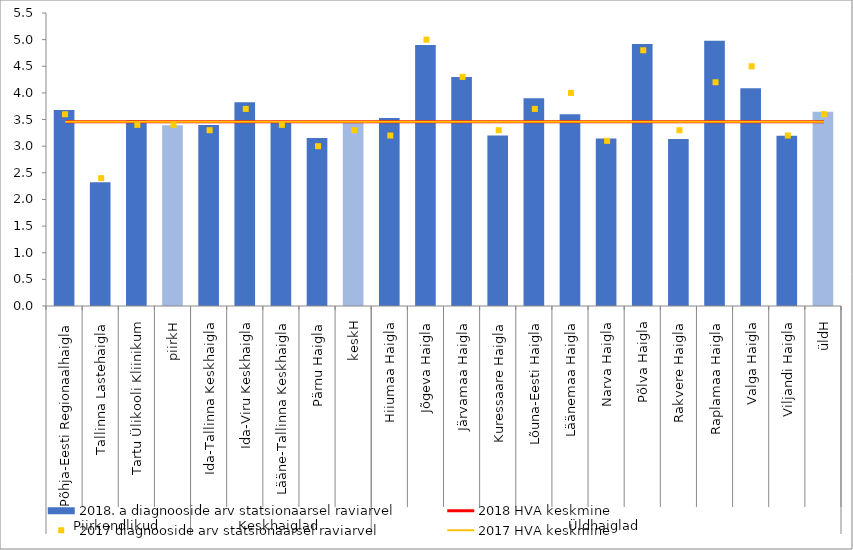
| Category | 2018. a diagnooside arv statsionaarsel raviarvel |
|---|---|
| 0 | 3.68 |
| 1 | 2.322 |
| 2 | 3.488 |
| 3 | 3.391 |
| 4 | 3.399 |
| 5 | 3.825 |
| 6 | 3.443 |
| 7 | 3.153 |
| 8 | 3.439 |
| 9 | 3.529 |
| 10 | 4.9 |
| 11 | 4.3 |
| 12 | 3.2 |
| 13 | 3.9 |
| 14 | 3.6 |
| 15 | 3.144 |
| 16 | 4.916 |
| 17 | 3.134 |
| 18 | 4.979 |
| 19 | 4.089 |
| 20 | 3.195 |
| 21 | 3.644 |